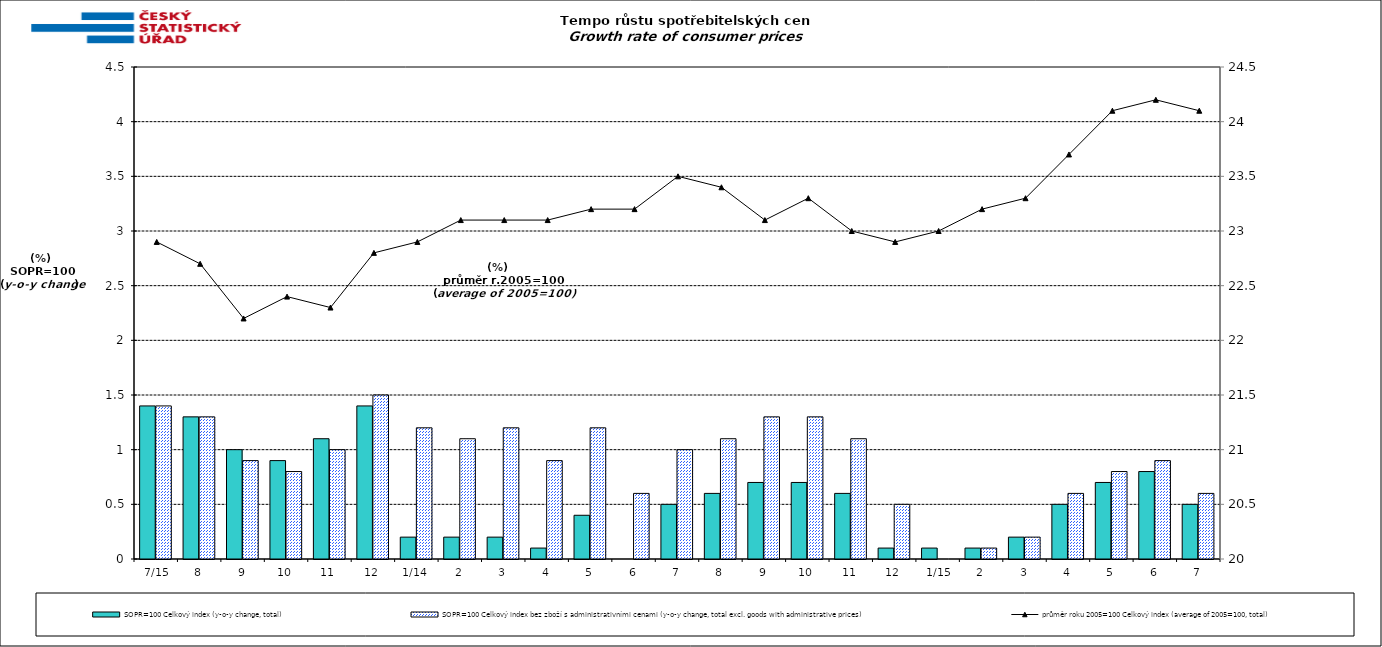
| Category | SOPR=100 Celkový index (y-o-y change, total) | SOPR=100 Celkový index bez zboží s administrativními cenami (y-o-y change, total excl. goods with administrative prices)  |
|---|---|---|
|  7/15 | 1.4 | 1.4 |
| 8 | 1.3 | 1.3 |
| 9 | 1 | 0.9 |
| 10 | 0.9 | 0.8 |
| 11 | 1.1 | 1 |
| 12 | 1.4 | 1.5 |
| 1/14 | 0.2 | 1.2 |
| 2 | 0.2 | 1.1 |
| 3 | 0.2 | 1.2 |
| 4 | 0.1 | 0.9 |
| 5 | 0.4 | 1.2 |
| 6 | 0 | 0.6 |
| 7 | 0.5 | 1 |
| 8 | 0.6 | 1.1 |
| 9 | 0.7 | 1.3 |
| 10 | 0.7 | 1.3 |
| 11 | 0.6 | 1.1 |
| 12 | 0.1 | 0.5 |
|  1/15 | 0.1 | 0 |
| 2 | 0.1 | 0.1 |
| 3 | 0.2 | 0.2 |
| 4 | 0.5 | 0.6 |
| 5 | 0.7 | 0.8 |
| 6 | 0.8 | 0.9 |
| 7 | 0.5 | 0.6 |